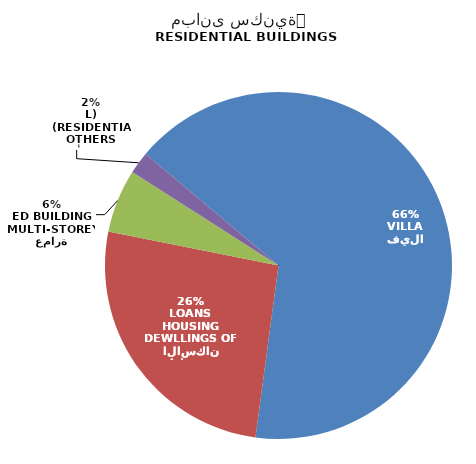
| Category | Series 0 |
|---|---|
| فيلا
VILLA | 1474 |
| مساكن قروض الاسكان
DEWLLINGS OF HOUSING LOANS | 581 |
| عمارة
MULTI-STOREYED BUILDING | 132 |
| أخرى
OTHERS (RESIDENTIAL) | 46 |